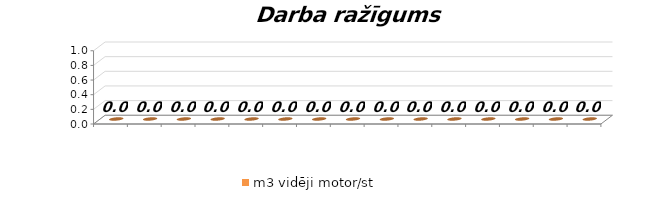
| Category | m3 vidēji motor/st |
|---|---|
|  | 0 |
|  | 0 |
|  | 0 |
|  | 0 |
|  | 0 |
|  | 0 |
|  | 0 |
|  | 0 |
|  | 0 |
|  | 0 |
|  | 0 |
|  | 0 |
|  | 0 |
|  | 0 |
|  | 0 |